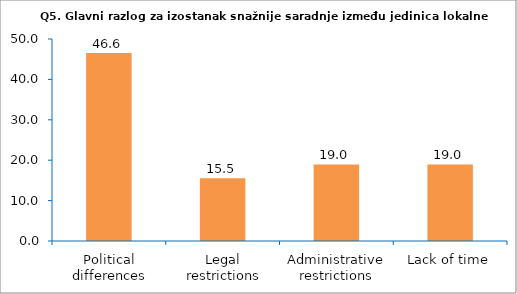
| Category | Series 0 |
|---|---|
| Political differences | 46.552 |
| Legal restrictions | 15.517 |
| Administrative restrictions | 18.966 |
| Lack of time | 18.966 |